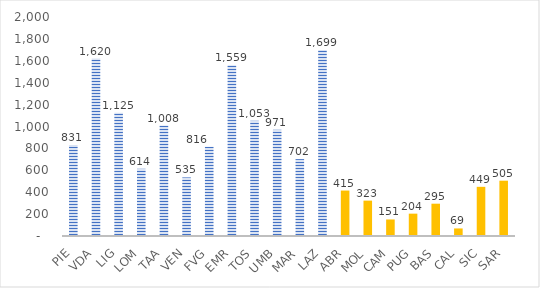
| Category | nidi e sezioni primavera |
|---|---|
| PIE | 831 |
| VDA | 1620 |
| LIG | 1125 |
| LOM | 614 |
| TAA | 1008 |
| VEN | 535 |
| FVG | 816 |
| EMR | 1559 |
| TOS | 1053 |
| UMB | 971 |
| MAR | 702 |
| LAZ | 1699 |
| ABR | 415 |
| MOL | 323 |
| CAM | 151 |
| PUG | 204 |
| BAS | 295 |
| CAL | 69 |
| SIC | 449 |
| SAR | 505 |